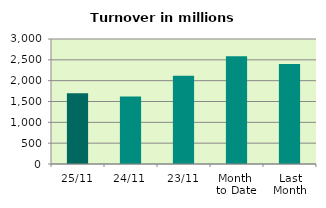
| Category | Series 0 |
|---|---|
| 25/11 | 1700.608 |
| 24/11 | 1619.933 |
| 23/11 | 2120.938 |
| Month 
to Date | 2583.694 |
| Last
Month | 2399.244 |